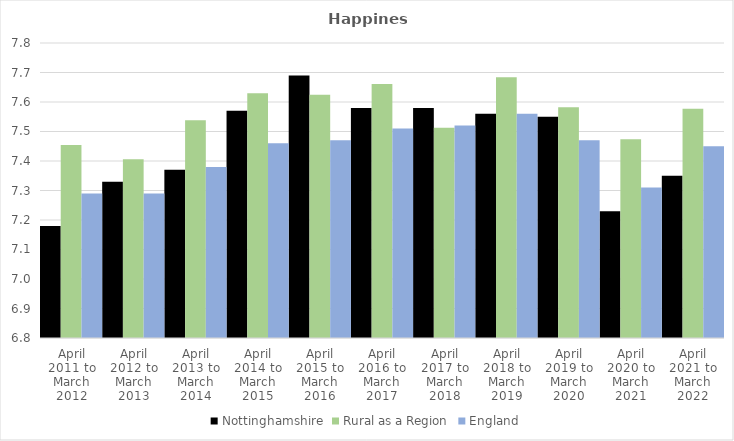
| Category | Nottinghamshire | Rural as a Region | England |
|---|---|---|---|
| April 2011 to March 2012 | 7.18 | 7.454 | 7.29 |
| April 2012 to March 2013 | 7.33 | 7.406 | 7.29 |
| April 2013 to March 2014 | 7.37 | 7.539 | 7.38 |
| April 2014 to March 2015 | 7.57 | 7.63 | 7.46 |
| April 2015 to March 2016 | 7.69 | 7.625 | 7.47 |
| April 2016 to March 2017 | 7.58 | 7.661 | 7.51 |
| April 2017 to March 2018 | 7.58 | 7.513 | 7.52 |
| April 2018 to March 2019 | 7.56 | 7.684 | 7.56 |
| April 2019 to March 2020 | 7.55 | 7.582 | 7.47 |
| April 2020 to March 2021 | 7.23 | 7.474 | 7.31 |
| April 2021 to March 2022 | 7.35 | 7.577 | 7.45 |